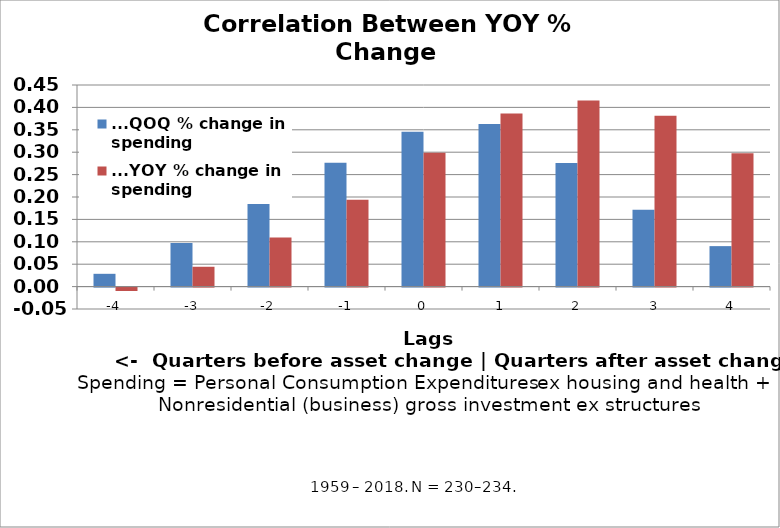
| Category | ...QOQ % change in spending | ...YOY % change in spending |
|---|---|---|
| -4.0 | 0.029 | -0.008 |
| -3.0 | 0.097 | 0.044 |
| -2.0 | 0.188 | 0.109 |
| -1.0 | 0.277 | 0.194 |
| 0.0 | 0.346 | 0.299 |
| 1.0 | 0.363 | 0.386 |
| 2.0 | 0.276 | 0.415 |
| 3.0 | 0.171 | 0.381 |
| 4.0 | 0.09 | 0.297 |